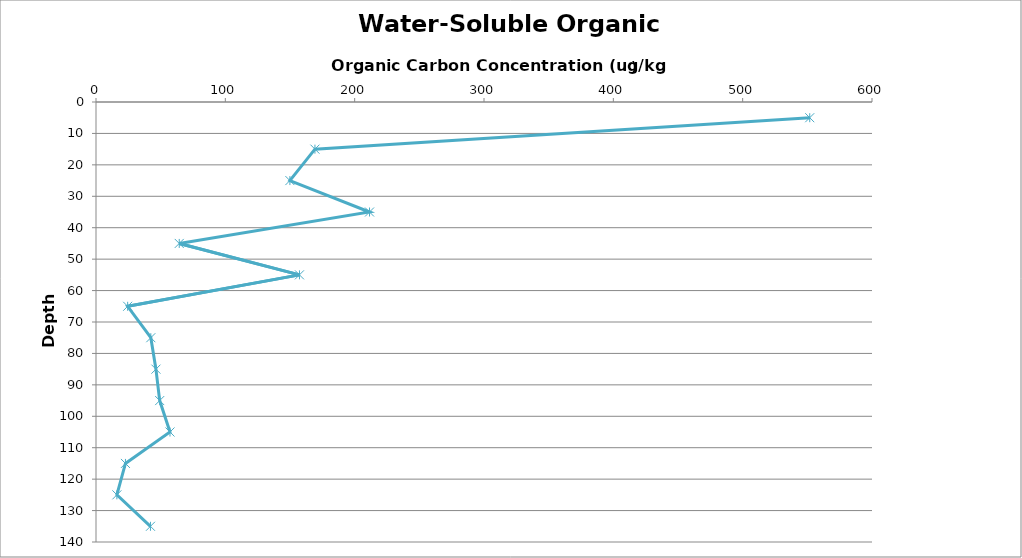
| Category | Water Soluble Organic Carbon |
|---|---|
| 551.8607367450188 | 5 |
| 169.28556730980475 | 15 |
| 149.91561322011077 | 25 |
| 211.48138750674346 | 35 |
| 64.36244708473924 | 45 |
| 157.31442966087576 | 55 |
| 24.478498528414615 | 65 |
| 42.39001249949401 | 75 |
| 46.34009808095622 | 85 |
| 49.24595280941035 | 95 |
| 57.20761345809583 | 105 |
| 22.770842217608468 | 115 |
| 16.14796767434561 | 125 |
| 42.105096842192964 | 135 |